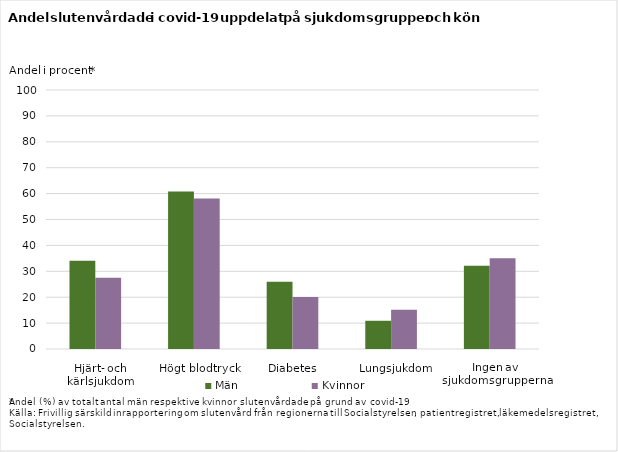
| Category | Män | Kvinnor |
|---|---|---|
| Hjärt- och kärlsjukdom | 34.086 | 27.53 |
| Högt blodtryck | 60.826 | 58.151 |
| Diabetes | 25.932 | 20.06 |
| Lungsjukdom | 10.903 | 15.123 |
| Ingen av sjukdomsgrupperna | 32.147 | 34.999 |